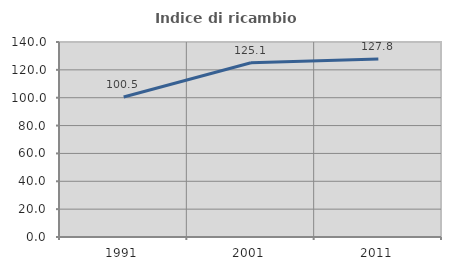
| Category | Indice di ricambio occupazionale  |
|---|---|
| 1991.0 | 100.546 |
| 2001.0 | 125.09 |
| 2011.0 | 127.754 |